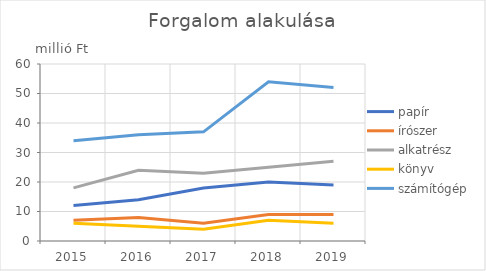
| Category | papír | írószer | alkatrész | könyv | számítógép |
|---|---|---|---|---|---|
| 2015.0 | 12 | 7 | 18 | 6 | 34 |
| 2016.0 | 14 | 8 | 24 | 5 | 36 |
| 2017.0 | 18 | 6 | 23 | 4 | 37 |
| 2018.0 | 20 | 9 | 25 | 7 | 54 |
| 2019.0 | 19 | 9 | 27 | 6 | 52 |